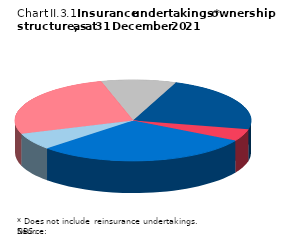
| Category | Serbia |
|---|---|
| Serbia | 0.296 |
| Slovenia | 0.067 |
| Austria | 0.26 |
| Italy | 0.103 |
| Netherlands | 0.226 |
| Other | 0.048 |